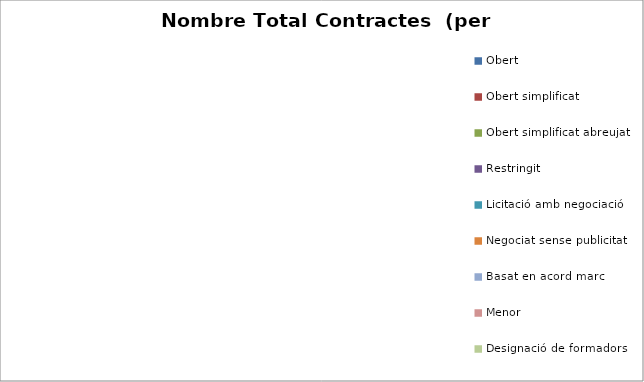
| Category | Nombre Total Contractes |
|---|---|
| Obert | 0 |
| Obert simplificat | 0 |
| Obert simplificat abreujat | 0 |
| Restringit | 0 |
| Licitació amb negociació | 0 |
| Negociat sense publicitat | 0 |
| Basat en acord marc | 0 |
| Menor | 0 |
| Designació de formadors | 0 |